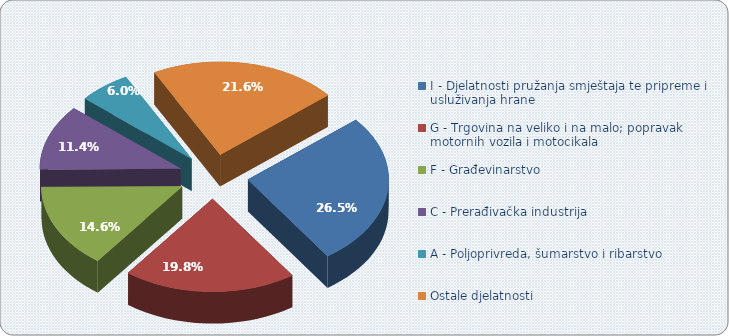
| Category | Ukupni prihodi 2019 |
|---|---|
| I - Djelatnosti pružanja smještaja te pripreme i usluživanja hrane  | 3200954.379 |
| G - Trgovina na veliko i na malo; popravak motornih vozila i motocikala | 2393542.745 |
| F - Građevinarstvo | 1766068.511 |
| C - Prerađivačka industrija | 1374504.836 |
| A - Poljoprivreda, šumarstvo i ribarstvo | 720968.925 |
| Ostale djelatnosti | 2609978.215 |